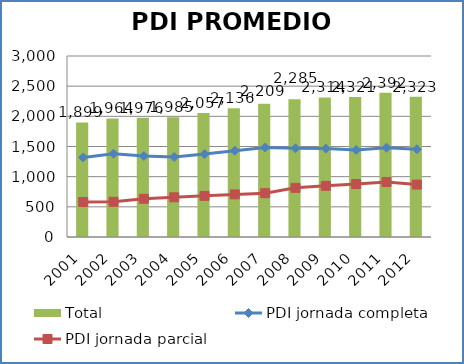
| Category | Total |
|---|---|
| 0 | 1898.552 |
| 1 | 1964.22 |
| 2 | 1975.656 |
| 3 | 1984.979 |
| 4 | 2056.705 |
| 5 | 2136.007 |
| 6 | 2209.264 |
| 7 | 2285.075 |
| 8 | 2313.608 |
| 9 | 2321.307 |
| 10 | 2392 |
| 11 | 2323 |